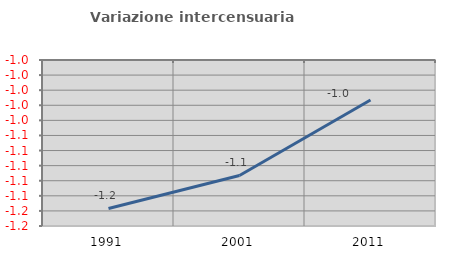
| Category | Variazione intercensuaria annua |
|---|---|
| 1991.0 | -1.157 |
| 2001.0 | -1.113 |
| 2011.0 | -1.013 |